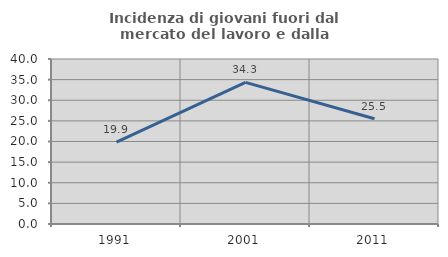
| Category | Incidenza di giovani fuori dal mercato del lavoro e dalla formazione  |
|---|---|
| 1991.0 | 19.861 |
| 2001.0 | 34.337 |
| 2011.0 | 25.52 |